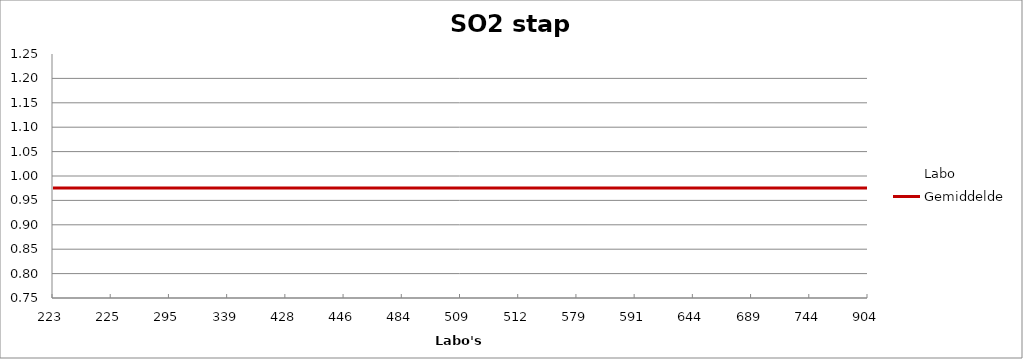
| Category | Labo | Gemiddelde |
|---|---|---|
| 223.0 | 1.04 | 0.976 |
| 225.0 | 1.009 | 0.976 |
| 295.0 | 0.933 | 0.976 |
| 339.0 | 0.759 | 0.976 |
| 428.0 | 1.218 | 0.976 |
| 446.0 | 1.046 | 0.976 |
| 484.0 | 0.977 | 0.976 |
| 509.0 | 0.987 | 0.976 |
| 512.0 | 0.991 | 0.976 |
| 579.0 | 0.966 | 0.976 |
| 591.0 | 0.91 | 0.976 |
| 644.0 | 0.933 | 0.976 |
| 689.0 | 0.942 | 0.976 |
| 744.0 | 1.008 | 0.976 |
| 904.0 | 0.941 | 0.976 |